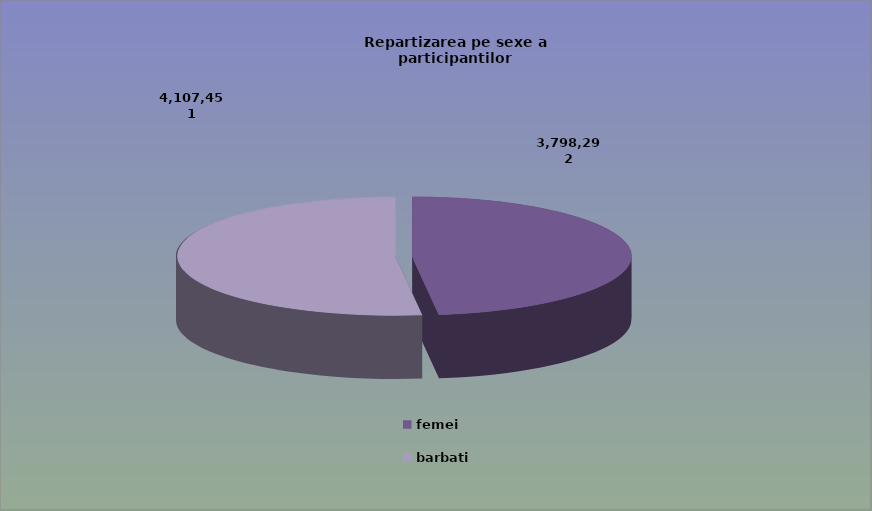
| Category | Series 0 |
|---|---|
| femei | 3798292 |
| barbati | 4107451 |